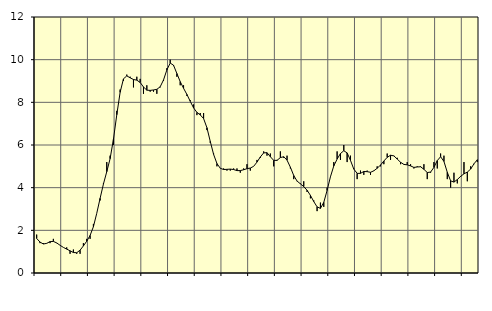
| Category | Piggar | Series 1 |
|---|---|---|
| nan | 1.8 | 1.62 |
| 87.0 | 1.4 | 1.45 |
| 87.0 | 1.4 | 1.36 |
| 87.0 | 1.4 | 1.39 |
| nan | 1.4 | 1.47 |
| 88.0 | 1.6 | 1.48 |
| 88.0 | 1.4 | 1.41 |
| 88.0 | 1.3 | 1.3 |
| nan | 1.2 | 1.2 |
| 89.0 | 1.2 | 1.12 |
| 89.0 | 0.9 | 1.04 |
| 89.0 | 1.1 | 0.96 |
| nan | 0.9 | 0.95 |
| 90.0 | 0.9 | 1.07 |
| 90.0 | 1.4 | 1.27 |
| 90.0 | 1.6 | 1.49 |
| nan | 1.6 | 1.76 |
| 91.0 | 2.3 | 2.17 |
| 91.0 | 2.8 | 2.8 |
| 91.0 | 3.4 | 3.5 |
| nan | 4.2 | 4.17 |
| 92.0 | 5.2 | 4.75 |
| 92.0 | 5.5 | 5.36 |
| 92.0 | 6 | 6.27 |
| nan | 7.6 | 7.42 |
| 93.0 | 8.6 | 8.47 |
| 93.0 | 9 | 9.1 |
| 93.0 | 9.3 | 9.24 |
| nan | 9.2 | 9.15 |
| 94.0 | 8.7 | 9.07 |
| 94.0 | 9.2 | 9.04 |
| 94.0 | 9.1 | 8.93 |
| nan | 8.4 | 8.72 |
| 95.0 | 8.8 | 8.57 |
| 95.0 | 8.5 | 8.56 |
| 95.0 | 8.5 | 8.58 |
| nan | 8.4 | 8.61 |
| 96.0 | 8.7 | 8.73 |
| 96.0 | 9 | 9.05 |
| 96.0 | 9.6 | 9.52 |
| nan | 10 | 9.84 |
| 97.0 | 9.7 | 9.74 |
| 97.0 | 9.2 | 9.35 |
| 97.0 | 8.8 | 8.97 |
| nan | 8.8 | 8.66 |
| 98.0 | 8.3 | 8.37 |
| 98.0 | 8.1 | 8.05 |
| 98.0 | 7.9 | 7.74 |
| nan | 7.4 | 7.53 |
| 99.0 | 7.5 | 7.41 |
| 99.0 | 7.5 | 7.24 |
| 99.0 | 6.7 | 6.81 |
| nan | 6.1 | 6.17 |
| 0.0 | 5.6 | 5.56 |
| 0.0 | 5 | 5.13 |
| 0.0 | 4.9 | 4.91 |
| nan | 4.9 | 4.85 |
| 1.0 | 4.8 | 4.86 |
| 1.0 | 4.8 | 4.87 |
| 1.0 | 4.9 | 4.85 |
| nan | 4.9 | 4.8 |
| 2.0 | 4.7 | 4.8 |
| 2.0 | 4.9 | 4.84 |
| 2.0 | 5.1 | 4.89 |
| nan | 4.8 | 4.92 |
| 3.0 | 5 | 5 |
| 3.0 | 5.3 | 5.2 |
| 3.0 | 5.4 | 5.44 |
| nan | 5.7 | 5.63 |
| 4.0 | 5.5 | 5.64 |
| 4.0 | 5.6 | 5.45 |
| 4.0 | 5 | 5.28 |
| nan | 5.3 | 5.28 |
| 5.0 | 5.7 | 5.41 |
| 5.0 | 5.4 | 5.45 |
| 5.0 | 5.5 | 5.29 |
| nan | 4.9 | 4.96 |
| 6.0 | 4.4 | 4.57 |
| 6.0 | 4.3 | 4.31 |
| 6.0 | 4.2 | 4.18 |
| nan | 4.3 | 4.05 |
| 7.0 | 3.8 | 3.88 |
| 7.0 | 3.5 | 3.64 |
| 7.0 | 3.4 | 3.35 |
| nan | 2.9 | 3.1 |
| 8.0 | 3.3 | 3.03 |
| 8.0 | 3.1 | 3.31 |
| 8.0 | 4 | 3.87 |
| nan | 4.5 | 4.51 |
| 9.0 | 5.2 | 5.02 |
| 9.0 | 5.7 | 5.34 |
| 9.0 | 5.3 | 5.6 |
| nan | 6 | 5.73 |
| 10.0 | 5.2 | 5.63 |
| 10.0 | 5.5 | 5.28 |
| 10.0 | 4.9 | 4.87 |
| nan | 4.4 | 4.67 |
| 11.0 | 4.8 | 4.67 |
| 11.0 | 4.6 | 4.76 |
| 11.0 | 4.8 | 4.75 |
| nan | 4.6 | 4.72 |
| 12.0 | 4.8 | 4.79 |
| 12.0 | 5 | 4.91 |
| 12.0 | 5 | 5.06 |
| nan | 5.1 | 5.25 |
| 13.0 | 5.6 | 5.42 |
| 13.0 | 5.3 | 5.52 |
| 13.0 | 5.5 | 5.49 |
| nan | 5.4 | 5.34 |
| 14.0 | 5.1 | 5.19 |
| 14.0 | 5.1 | 5.09 |
| 14.0 | 5.2 | 5.07 |
| nan | 5.1 | 5.02 |
| 15.0 | 4.9 | 4.95 |
| 15.0 | 5 | 4.97 |
| 15.0 | 5 | 4.98 |
| nan | 5.1 | 4.86 |
| 16.0 | 4.4 | 4.71 |
| 16.0 | 4.7 | 4.73 |
| 16.0 | 5.2 | 4.95 |
| nan | 4.9 | 5.27 |
| 17.0 | 5.6 | 5.45 |
| 17.0 | 5.5 | 5.23 |
| 17.0 | 4.4 | 4.72 |
| nan | 4 | 4.32 |
| 18.0 | 4.7 | 4.26 |
| 18.0 | 4.2 | 4.38 |
| 18.0 | 4.5 | 4.53 |
| nan | 5.2 | 4.65 |
| 19.0 | 4.3 | 4.73 |
| 19.0 | 5 | 4.87 |
| 19.0 | 5.1 | 5.12 |
| nan | 5.2 | 5.31 |